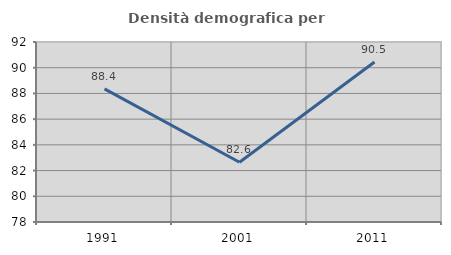
| Category | Densità demografica |
|---|---|
| 1991.0 | 88.354 |
| 2001.0 | 82.645 |
| 2011.0 | 90.451 |